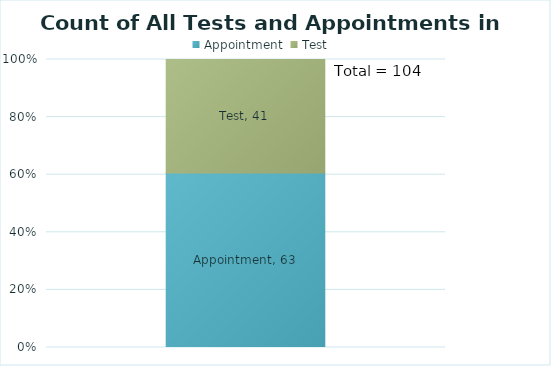
| Category | Appointment | Test |
|---|---|---|
| Count of appointments and tests | 63 | 41 |